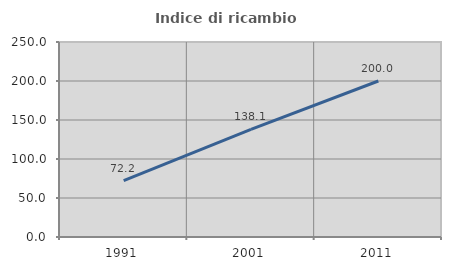
| Category | Indice di ricambio occupazionale  |
|---|---|
| 1991.0 | 72.222 |
| 2001.0 | 138.095 |
| 2011.0 | 200 |